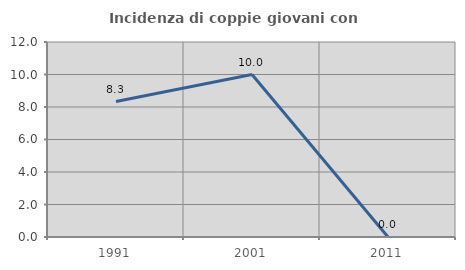
| Category | Incidenza di coppie giovani con figli |
|---|---|
| 1991.0 | 8.333 |
| 2001.0 | 10 |
| 2011.0 | 0 |